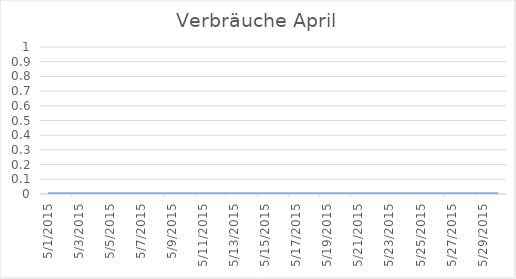
| Category | Series 0 |
|---|---|
| 01/05/2015 | 0 |
| 02/05/2015 | 0 |
| 03/05/2015 | 0 |
| 04/05/2015 | 0 |
| 05/05/2015 | 0 |
| 06/05/2015 | 0 |
| 07/05/2015 | 0 |
| 08/05/2015 | 0 |
| 09/05/2015 | 0 |
| 10/05/2015 | 0 |
| 11/05/2015 | 0 |
| 12/05/2015 | 0 |
| 13/05/2015 | 0 |
| 14/05/2015 | 0 |
| 15/05/2015 | 0 |
| 16/05/2015 | 0 |
| 17/05/2015 | 0 |
| 18/05/2015 | 0 |
| 19/05/2015 | 0 |
| 20/05/2015 | 0 |
| 21/05/2015 | 0 |
| 22/05/2015 | 0 |
| 23/05/2015 | 0 |
| 24/05/2015 | 0 |
| 25/05/2015 | 0 |
| 26/05/2015 | 0 |
| 27/05/2015 | 0 |
| 28/05/2015 | 0 |
| 29/05/2015 | 0 |
| 30/05/2015 | 0 |